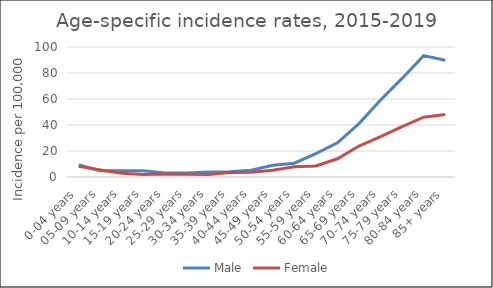
| Category | Male | Female |
|---|---|---|
| 0-04 years | 9.2 | 8.2 |
| 05-09 years | 4.9 | 5.41 |
| 10-14 years | 4.77 | 2.91 |
| 15-19 years | 4.82 | 1.91 |
| 20-24 years | 3.1 | 2.25 |
| 25-29 years | 3.09 | 2.14 |
| 30-34 years | 3.79 | 1.95 |
| 35-39 years | 4 | 3.42 |
| 40-44 years | 5.23 | 3.67 |
| 45-49 years | 9.04 | 5.13 |
| 50-54 years | 10.61 | 7.94 |
| 55-59 years | 17.93 | 8.55 |
| 60-64 years | 26.27 | 14.03 |
| 65-69 years | 41.11 | 23.79 |
| 70-74 years | 59.2 | 30.99 |
| 75-79 years | 75.82 | 38.67 |
| 80-84 years | 93.37 | 46 |
| 85+ years | 89.8 | 47.99 |